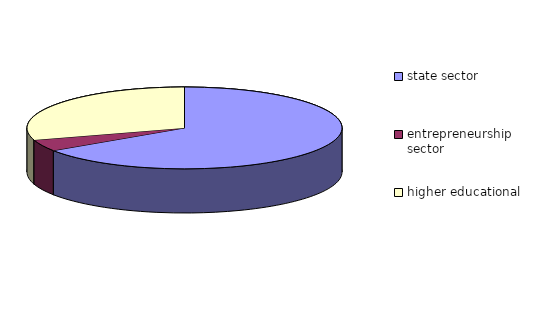
| Category | Series 0 |
|---|---|
| state sector | 86 |
| entrepreneurship  sector | 6 |
| higher educational | 39 |